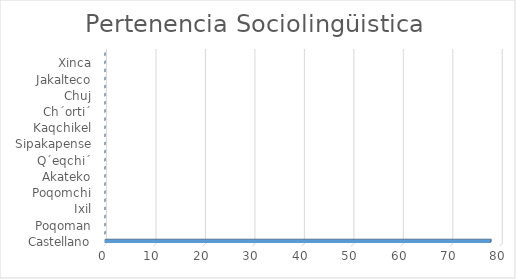
| Category | Series 0 |
|---|---|
| Castellano | 78 |
| Itza´ | 0 |
| Poqoman | 0 |
| Achi | 0 |
| Ixil | 0 |
| Q´anjob´al | 0 |
| Poqomchi | 0 |
| Sakapulteko | 0 |
| Akateko | 0 |
| K´iche´ | 0 |
| Q´eqchi´ | 0 |
| Mopan | 0 |
| Sipakapense | 0 |
| Awakateko | 0 |
| Kaqchikel | 0 |
| Uspanteko | 0 |
| Ch´orti´ | 0 |
| Tektiteko | 0 |
| Chuj | 0 |
| Man | 0 |
| Jakalteco | 0 |
| Tz´utujil | 0 |
| Xinca | 0 |
| Garifuna | 0 |